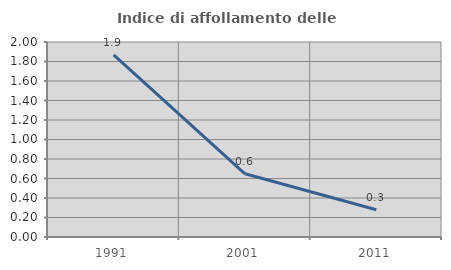
| Category | Indice di affollamento delle abitazioni  |
|---|---|
| 1991.0 | 1.868 |
| 2001.0 | 0.649 |
| 2011.0 | 0.28 |